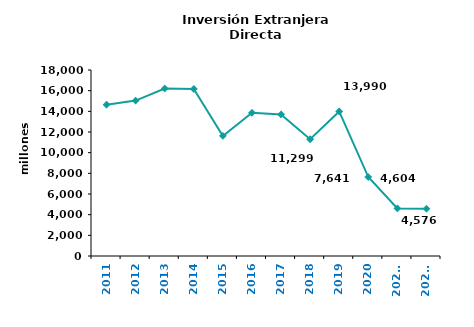
| Category | Series 0 |
|---|---|
| 2011 | 14647.043 |
| 2012 | 15039.966 |
| 2013 | 16210.41 |
| 2014 | 16168.707 |
| 2015 | 11621 |
| 2016 | 13858 |
| 2017 | 13701 |
| 2018 | 11299 |
| 2019 | 13990 |
| 2020 | 7641 |
| 2020* | 4604 |
| 2021* | 4576 |